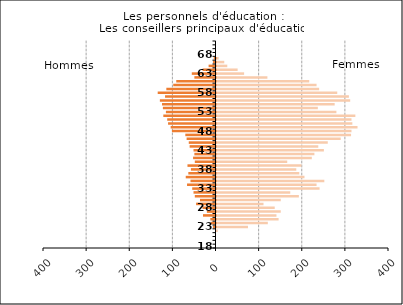
| Category | Series 2 |
|---|---|
| 18.0 | 0 |
| 19.0 | 0 |
| 20.0 | 0 |
| 21.0 | 0 |
| 22.0 | 3 |
| 23.0 | 73 |
| 24.0 | 119 |
| 25.0 | 144 |
| 26.0 | 139 |
| 27.0 | 149 |
| 28.0 | 135 |
| 29.0 | 109 |
| 30.0 | 149 |
| 31.0 | 191 |
| 32.0 | 171 |
| 33.0 | 239 |
| 34.0 | 232 |
| 35.0 | 250 |
| 36.0 | 204 |
| 37.0 | 192 |
| 38.0 | 185 |
| 39.0 | 197 |
| 40.0 | 164 |
| 41.0 | 221 |
| 42.0 | 227 |
| 43.0 | 249 |
| 44.0 | 236 |
| 45.0 | 258 |
| 46.0 | 288 |
| 47.0 | 312 |
| 48.0 | 313 |
| 49.0 | 327 |
| 50.0 | 315 |
| 51.0 | 313 |
| 52.0 | 322 |
| 53.0 | 278 |
| 54.0 | 235 |
| 55.0 | 274 |
| 56.0 | 310 |
| 57.0 | 307 |
| 58.0 | 280 |
| 59.0 | 238 |
| 60.0 | 232 |
| 61.0 | 215 |
| 62.0 | 118 |
| 63.0 | 64 |
| 64.0 | 49 |
| 65.0 | 25 |
| 66.0 | 18 |
| 67.0 | 5 |
| 68.0 | 0 |
| 69.0 | 0 |
| 70.0 | 0 |
| 75.0 | 0 |